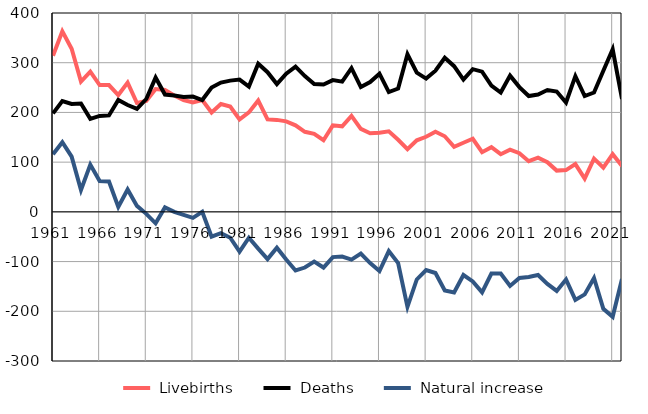
| Category |  Livebirths |  Deaths |  Natural increase |
|---|---|---|---|
| 1961.0 | 314 | 198 | 116 |
| 1962.0 | 363 | 223 | 140 |
| 1963.0 | 328 | 217 | 111 |
| 1964.0 | 262 | 218 | 44 |
| 1965.0 | 282 | 187 | 95 |
| 1966.0 | 255 | 193 | 62 |
| 1967.0 | 255 | 194 | 61 |
| 1968.0 | 235 | 225 | 10 |
| 1969.0 | 260 | 215 | 45 |
| 1970.0 | 219 | 207 | 12 |
| 1971.0 | 223 | 227 | -4 |
| 1972.0 | 247 | 270 | -23 |
| 1973.0 | 245 | 236 | 9 |
| 1974.0 | 234 | 234 | 0 |
| 1975.0 | 225 | 231 | -6 |
| 1976.0 | 220 | 232 | -12 |
| 1977.0 | 225 | 225 | 0 |
| 1978.0 | 200 | 250 | -50 |
| 1979.0 | 217 | 260 | -43 |
| 1980.0 | 212 | 264 | -52 |
| 1981.0 | 186 | 266 | -80 |
| 1982.0 | 200 | 252 | -52 |
| 1983.0 | 224 | 298 | -74 |
| 1984.0 | 186 | 281 | -95 |
| 1985.0 | 185 | 257 | -72 |
| 1986.0 | 182 | 278 | -96 |
| 1987.0 | 174 | 292 | -118 |
| 1988.0 | 161 | 273 | -112 |
| 1989.0 | 157 | 257 | -100 |
| 1990.0 | 144 | 256 | -112 |
| 1991.0 | 174 | 265 | -91 |
| 1992.0 | 172 | 262 | -90 |
| 1993.0 | 193 | 289 | -96 |
| 1994.0 | 167 | 251 | -84 |
| 1995.0 | 158 | 261 | -103 |
| 1996.0 | 159 | 278 | -119 |
| 1997.0 | 162 | 241 | -79 |
| 1998.0 | 145 | 248 | -103 |
| 1999.0 | 126 | 317 | -191 |
| 2000.0 | 144 | 280 | -136 |
| 2001.0 | 151 | 268 | -117 |
| 2002.0 | 161 | 284 | -123 |
| 2003.0 | 152 | 310 | -158 |
| 2004.0 | 131 | 293 | -162 |
| 2005.0 | 139 | 266 | -127 |
| 2006.0 | 147 | 287 | -140 |
| 2007.0 | 120 | 282 | -162 |
| 2008.0 | 130 | 254 | -124 |
| 2009.0 | 116 | 240 | -124 |
| 2010.0 | 125 | 274 | -149 |
| 2011.0 | 118 | 251 | -133 |
| 2012.0 | 102 | 233 | -131 |
| 2013.0 | 109 | 236 | -127 |
| 2014.0 | 100 | 245 | -145 |
| 2015.0 | 83 | 242 | -159 |
| 2016.0 | 84 | 220 | -136 |
| 2017.0 | 96 | 273 | -177 |
| 2018.0 | 67 | 233 | -166 |
| 2019.0 | 107 | 240 | -133 |
| 2020.0 | 89 | 284 | -195 |
| 2021.0 | 116 | 327 | -211 |
| 2022.0 | 92 | 227 | -135 |